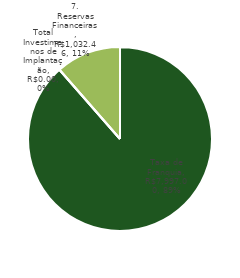
| Category | Series 0 |
|---|---|
| Taxa de Franquia | 7997 |
| Total Investimenos de Implantação | 0 |
| 7. Reservas Financeiras | 1032.464 |